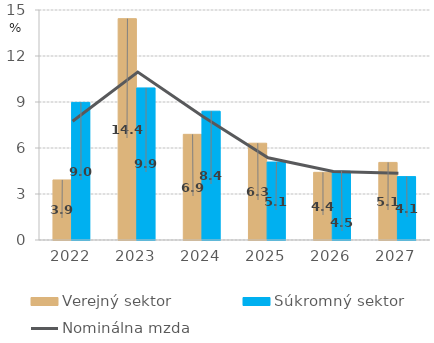
| Category | Verejný sektor | Súkromný sektor |
|---|---|---|
| 2022.0 | 3.916 | 8.973 |
| 2023.0 | 14.436 | 9.918 |
| 2024.0 | 6.891 | 8.399 |
| 2025.0 | 6.312 | 5.084 |
| 2026.0 | 4.414 | 4.486 |
| 2027.0 | 5.06 | 4.133 |